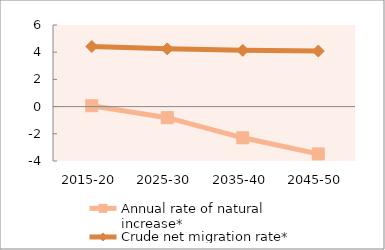
| Category | Annual rate of natural increase* | Crude net migration rate* |
|---|---|---|
| 2015-20 | 0.063 | 4.419 |
| 2025-30 | -0.813 | 4.246 |
| 2035-40 | -2.295 | 4.135 |
| 2045-50 | -3.479 | 4.087 |